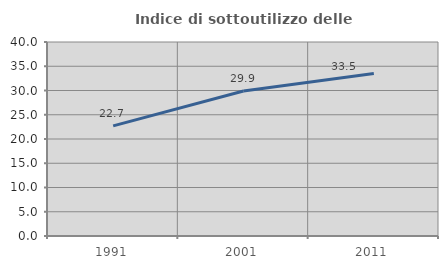
| Category | Indice di sottoutilizzo delle abitazioni  |
|---|---|
| 1991.0 | 22.705 |
| 2001.0 | 29.892 |
| 2011.0 | 33.513 |